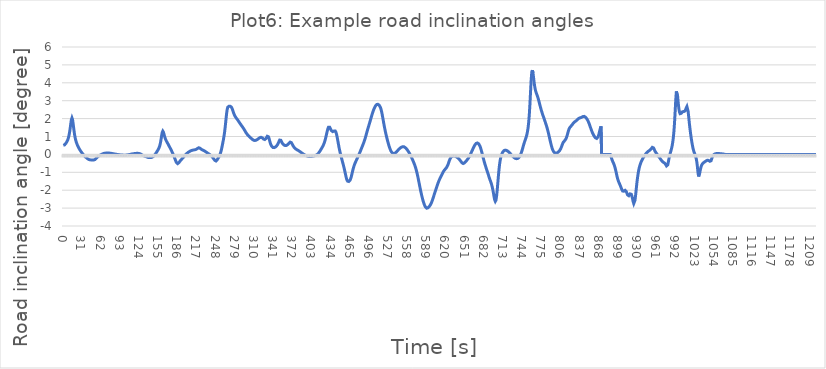
| Category | Series 0 |
|---|---|
| 0.0 | 0.505 |
| 1.0 | 0.505 |
| 2.0 | 0.532 |
| 3.0 | 0.567 |
| 4.0 | 0.61 |
| 5.0 | 0.661 |
| 6.0 | 0.722 |
| 7.0 | 0.797 |
| 8.0 | 0.895 |
| 9.0 | 1.027 |
| 10.0 | 1.203 |
| 11.0 | 1.429 |
| 12.0 | 1.692 |
| 13.0 | 1.93 |
| 14.0 | 2.037 |
| 15.0 | 1.941 |
| 16.0 | 1.693 |
| 17.0 | 1.408 |
| 18.0 | 1.158 |
| 19.0 | 0.96 |
| 20.0 | 0.806 |
| 21.0 | 0.685 |
| 22.0 | 0.585 |
| 23.0 | 0.501 |
| 24.0 | 0.427 |
| 25.0 | 0.361 |
| 26.0 | 0.301 |
| 27.0 | 0.245 |
| 28.0 | 0.191 |
| 29.0 | 0.14 |
| 30.0 | 0.092 |
| 31.0 | 0.048 |
| 32.0 | 0.006 |
| 33.0 | -0.034 |
| 34.0 | -0.072 |
| 35.0 | -0.109 |
| 36.0 | -0.143 |
| 37.0 | -0.176 |
| 38.0 | -0.206 |
| 39.0 | -0.233 |
| 40.0 | -0.257 |
| 41.0 | -0.278 |
| 42.0 | -0.294 |
| 43.0 | -0.304 |
| 44.0 | -0.308 |
| 45.0 | -0.308 |
| 46.0 | -0.307 |
| 47.0 | -0.308 |
| 48.0 | -0.311 |
| 49.0 | -0.313 |
| 50.0 | -0.308 |
| 51.0 | -0.291 |
| 52.0 | -0.262 |
| 53.0 | -0.226 |
| 54.0 | -0.189 |
| 55.0 | -0.154 |
| 56.0 | -0.124 |
| 57.0 | -0.098 |
| 58.0 | -0.074 |
| 59.0 | -0.053 |
| 60.0 | -0.032 |
| 61.0 | -0.013 |
| 62.0 | 0.006 |
| 63.0 | 0.023 |
| 64.0 | 0.037 |
| 65.0 | 0.05 |
| 66.0 | 0.059 |
| 67.0 | 0.066 |
| 68.0 | 0.071 |
| 69.0 | 0.074 |
| 70.0 | 0.075 |
| 71.0 | 0.076 |
| 72.0 | 0.076 |
| 73.0 | 0.075 |
| 74.0 | 0.074 |
| 75.0 | 0.071 |
| 76.0 | 0.067 |
| 77.0 | 0.062 |
| 78.0 | 0.056 |
| 79.0 | 0.049 |
| 80.0 | 0.042 |
| 81.0 | 0.036 |
| 82.0 | 0.029 |
| 83.0 | 0.023 |
| 84.0 | 0.017 |
| 85.0 | 0.011 |
| 86.0 | 0.005 |
| 87.0 | -0.001 |
| 88.0 | -0.006 |
| 89.0 | -0.012 |
| 90.0 | -0.017 |
| 91.0 | -0.022 |
| 92.0 | -0.027 |
| 93.0 | -0.031 |
| 94.0 | -0.034 |
| 95.0 | -0.037 |
| 96.0 | -0.039 |
| 97.0 | -0.041 |
| 98.0 | -0.042 |
| 99.0 | -0.042 |
| 100.0 | -0.042 |
| 101.0 | -0.041 |
| 102.0 | -0.038 |
| 103.0 | -0.034 |
| 104.0 | -0.028 |
| 105.0 | -0.021 |
| 106.0 | -0.014 |
| 107.0 | -0.006 |
| 108.0 | 0.001 |
| 109.0 | 0.009 |
| 110.0 | 0.016 |
| 111.0 | 0.022 |
| 112.0 | 0.029 |
| 113.0 | 0.034 |
| 114.0 | 0.04 |
| 115.0 | 0.045 |
| 116.0 | 0.05 |
| 117.0 | 0.054 |
| 118.0 | 0.058 |
| 119.0 | 0.06 |
| 120.0 | 0.06 |
| 121.0 | 0.058 |
| 122.0 | 0.054 |
| 123.0 | 0.047 |
| 124.0 | 0.037 |
| 125.0 | 0.022 |
| 126.0 | 0.002 |
| 127.0 | -0.021 |
| 128.0 | -0.043 |
| 129.0 | -0.062 |
| 130.0 | -0.076 |
| 131.0 | -0.089 |
| 132.0 | -0.102 |
| 133.0 | -0.115 |
| 134.0 | -0.129 |
| 135.0 | -0.142 |
| 136.0 | -0.155 |
| 137.0 | -0.166 |
| 138.0 | -0.174 |
| 139.0 | -0.179 |
| 140.0 | -0.181 |
| 141.0 | -0.179 |
| 142.0 | -0.174 |
| 143.0 | -0.165 |
| 144.0 | -0.151 |
| 145.0 | -0.13 |
| 146.0 | -0.102 |
| 147.0 | -0.066 |
| 148.0 | -0.023 |
| 149.0 | 0.025 |
| 150.0 | 0.076 |
| 151.0 | 0.129 |
| 152.0 | 0.183 |
| 153.0 | 0.239 |
| 154.0 | 0.301 |
| 155.0 | 0.376 |
| 156.0 | 0.475 |
| 157.0 | 0.614 |
| 158.0 | 0.802 |
| 159.0 | 1.026 |
| 160.0 | 1.222 |
| 161.0 | 1.299 |
| 162.0 | 1.241 |
| 163.0 | 1.116 |
| 164.0 | 0.989 |
| 165.0 | 0.884 |
| 166.0 | 0.801 |
| 167.0 | 0.733 |
| 168.0 | 0.67 |
| 169.0 | 0.608 |
| 170.0 | 0.545 |
| 171.0 | 0.48 |
| 172.0 | 0.414 |
| 173.0 | 0.347 |
| 174.0 | 0.28 |
| 175.0 | 0.21 |
| 176.0 | 0.138 |
| 177.0 | 0.064 |
| 178.0 | -0.014 |
| 179.0 | -0.097 |
| 180.0 | -0.186 |
| 181.0 | -0.28 |
| 182.0 | -0.372 |
| 183.0 | -0.451 |
| 184.0 | -0.501 |
| 185.0 | -0.515 |
| 186.0 | -0.497 |
| 187.0 | -0.459 |
| 188.0 | -0.415 |
| 189.0 | -0.37 |
| 190.0 | -0.328 |
| 191.0 | -0.289 |
| 192.0 | -0.251 |
| 193.0 | -0.212 |
| 194.0 | -0.173 |
| 195.0 | -0.132 |
| 196.0 | -0.091 |
| 197.0 | -0.051 |
| 198.0 | -0.013 |
| 199.0 | 0.023 |
| 200.0 | 0.056 |
| 201.0 | 0.086 |
| 202.0 | 0.113 |
| 203.0 | 0.137 |
| 204.0 | 0.159 |
| 205.0 | 0.178 |
| 206.0 | 0.196 |
| 207.0 | 0.211 |
| 208.0 | 0.224 |
| 209.0 | 0.235 |
| 210.0 | 0.243 |
| 211.0 | 0.248 |
| 212.0 | 0.253 |
| 213.0 | 0.259 |
| 214.0 | 0.268 |
| 215.0 | 0.282 |
| 216.0 | 0.302 |
| 217.0 | 0.327 |
| 218.0 | 0.353 |
| 219.0 | 0.369 |
| 220.0 | 0.368 |
| 221.0 | 0.35 |
| 222.0 | 0.322 |
| 223.0 | 0.294 |
| 224.0 | 0.271 |
| 225.0 | 0.251 |
| 226.0 | 0.235 |
| 227.0 | 0.218 |
| 228.0 | 0.201 |
| 229.0 | 0.18 |
| 230.0 | 0.158 |
| 231.0 | 0.134 |
| 232.0 | 0.109 |
| 233.0 | 0.084 |
| 234.0 | 0.059 |
| 235.0 | 0.036 |
| 236.0 | 0.013 |
| 237.0 | -0.01 |
| 238.0 | -0.036 |
| 239.0 | -0.065 |
| 240.0 | -0.1 |
| 241.0 | -0.139 |
| 242.0 | -0.183 |
| 243.0 | -0.231 |
| 244.0 | -0.282 |
| 245.0 | -0.328 |
| 246.0 | -0.361 |
| 247.0 | -0.367 |
| 248.0 | -0.343 |
| 249.0 | -0.297 |
| 250.0 | -0.241 |
| 251.0 | -0.183 |
| 252.0 | -0.121 |
| 253.0 | -0.05 |
| 254.0 | 0.038 |
| 255.0 | 0.152 |
| 256.0 | 0.294 |
| 257.0 | 0.458 |
| 258.0 | 0.632 |
| 259.0 | 0.813 |
| 260.0 | 1.015 |
| 261.0 | 1.256 |
| 262.0 | 1.551 |
| 263.0 | 1.887 |
| 264.0 | 2.22 |
| 265.0 | 2.479 |
| 266.0 | 2.628 |
| 267.0 | 2.683 |
| 268.0 | 2.691 |
| 269.0 | 2.69 |
| 270.0 | 2.69 |
| 271.0 | 2.679 |
| 272.0 | 2.643 |
| 273.0 | 2.574 |
| 274.0 | 2.478 |
| 275.0 | 2.373 |
| 276.0 | 2.274 |
| 277.0 | 2.191 |
| 278.0 | 2.124 |
| 279.0 | 2.07 |
| 280.0 | 2.023 |
| 281.0 | 1.978 |
| 282.0 | 1.931 |
| 283.0 | 1.882 |
| 284.0 | 1.831 |
| 285.0 | 1.779 |
| 286.0 | 1.726 |
| 287.0 | 1.675 |
| 288.0 | 1.626 |
| 289.0 | 1.578 |
| 290.0 | 1.53 |
| 291.0 | 1.481 |
| 292.0 | 1.428 |
| 293.0 | 1.371 |
| 294.0 | 1.311 |
| 295.0 | 1.251 |
| 296.0 | 1.195 |
| 297.0 | 1.144 |
| 298.0 | 1.101 |
| 299.0 | 1.064 |
| 300.0 | 1.031 |
| 301.0 | 0.999 |
| 302.0 | 0.966 |
| 303.0 | 0.932 |
| 304.0 | 0.898 |
| 305.0 | 0.865 |
| 306.0 | 0.835 |
| 307.0 | 0.809 |
| 308.0 | 0.79 |
| 309.0 | 0.779 |
| 310.0 | 0.776 |
| 311.0 | 0.782 |
| 312.0 | 0.794 |
| 313.0 | 0.812 |
| 314.0 | 0.834 |
| 315.0 | 0.859 |
| 316.0 | 0.886 |
| 317.0 | 0.912 |
| 318.0 | 0.936 |
| 319.0 | 0.952 |
| 320.0 | 0.956 |
| 321.0 | 0.946 |
| 322.0 | 0.922 |
| 323.0 | 0.89 |
| 324.0 | 0.858 |
| 325.0 | 0.836 |
| 326.0 | 0.831 |
| 327.0 | 0.85 |
| 328.0 | 0.893 |
| 329.0 | 0.954 |
| 330.0 | 1.012 |
| 331.0 | 1.031 |
| 332.0 | 0.983 |
| 333.0 | 0.875 |
| 334.0 | 0.745 |
| 335.0 | 0.625 |
| 336.0 | 0.53 |
| 337.0 | 0.462 |
| 338.0 | 0.416 |
| 339.0 | 0.39 |
| 340.0 | 0.378 |
| 341.0 | 0.379 |
| 342.0 | 0.39 |
| 343.0 | 0.408 |
| 344.0 | 0.434 |
| 345.0 | 0.467 |
| 346.0 | 0.51 |
| 347.0 | 0.568 |
| 348.0 | 0.643 |
| 349.0 | 0.728 |
| 350.0 | 0.8 |
| 351.0 | 0.824 |
| 352.0 | 0.789 |
| 353.0 | 0.72 |
| 354.0 | 0.649 |
| 355.0 | 0.592 |
| 356.0 | 0.551 |
| 357.0 | 0.524 |
| 358.0 | 0.506 |
| 359.0 | 0.497 |
| 360.0 | 0.496 |
| 361.0 | 0.503 |
| 362.0 | 0.521 |
| 363.0 | 0.547 |
| 364.0 | 0.582 |
| 365.0 | 0.622 |
| 366.0 | 0.66 |
| 367.0 | 0.685 |
| 368.0 | 0.686 |
| 369.0 | 0.658 |
| 370.0 | 0.603 |
| 371.0 | 0.537 |
| 372.0 | 0.472 |
| 373.0 | 0.416 |
| 374.0 | 0.37 |
| 375.0 | 0.334 |
| 376.0 | 0.306 |
| 377.0 | 0.282 |
| 378.0 | 0.261 |
| 379.0 | 0.241 |
| 380.0 | 0.222 |
| 381.0 | 0.201 |
| 382.0 | 0.18 |
| 383.0 | 0.156 |
| 384.0 | 0.13 |
| 385.0 | 0.103 |
| 386.0 | 0.076 |
| 387.0 | 0.05 |
| 388.0 | 0.026 |
| 389.0 | 0.005 |
| 390.0 | -0.015 |
| 391.0 | -0.034 |
| 392.0 | -0.053 |
| 393.0 | -0.07 |
| 394.0 | -0.087 |
| 395.0 | -0.101 |
| 396.0 | -0.111 |
| 397.0 | -0.117 |
| 398.0 | -0.12 |
| 399.0 | -0.119 |
| 400.0 | -0.117 |
| 401.0 | -0.114 |
| 402.0 | -0.11 |
| 403.0 | -0.105 |
| 404.0 | -0.099 |
| 405.0 | -0.091 |
| 406.0 | -0.082 |
| 407.0 | -0.071 |
| 408.0 | -0.057 |
| 409.0 | -0.041 |
| 410.0 | -0.02 |
| 411.0 | 0.005 |
| 412.0 | 0.036 |
| 413.0 | 0.074 |
| 414.0 | 0.118 |
| 415.0 | 0.169 |
| 416.0 | 0.224 |
| 417.0 | 0.282 |
| 418.0 | 0.341 |
| 419.0 | 0.401 |
| 420.0 | 0.465 |
| 421.0 | 0.538 |
| 422.0 | 0.624 |
| 423.0 | 0.728 |
| 424.0 | 0.851 |
| 425.0 | 0.991 |
| 426.0 | 1.142 |
| 427.0 | 1.292 |
| 428.0 | 1.424 |
| 429.0 | 1.514 |
| 430.0 | 1.546 |
| 431.0 | 1.519 |
| 432.0 | 1.455 |
| 433.0 | 1.381 |
| 434.0 | 1.321 |
| 435.0 | 1.285 |
| 436.0 | 1.274 |
| 437.0 | 1.285 |
| 438.0 | 1.305 |
| 439.0 | 1.319 |
| 440.0 | 1.307 |
| 441.0 | 1.25 |
| 442.0 | 1.139 |
| 443.0 | 0.981 |
| 444.0 | 0.795 |
| 445.0 | 0.601 |
| 446.0 | 0.416 |
| 447.0 | 0.246 |
| 448.0 | 0.092 |
| 449.0 | -0.051 |
| 450.0 | -0.187 |
| 451.0 | -0.318 |
| 452.0 | -0.447 |
| 453.0 | -0.578 |
| 454.0 | -0.715 |
| 455.0 | -0.862 |
| 456.0 | -1.019 |
| 457.0 | -1.179 |
| 458.0 | -1.323 |
| 459.0 | -1.433 |
| 460.0 | -1.497 |
| 461.0 | -1.52 |
| 462.0 | -1.514 |
| 463.0 | -1.487 |
| 464.0 | -1.437 |
| 465.0 | -1.356 |
| 466.0 | -1.239 |
| 467.0 | -1.096 |
| 468.0 | -0.946 |
| 469.0 | -0.806 |
| 470.0 | -0.685 |
| 471.0 | -0.582 |
| 472.0 | -0.494 |
| 473.0 | -0.415 |
| 474.0 | -0.339 |
| 475.0 | -0.265 |
| 476.0 | -0.19 |
| 477.0 | -0.114 |
| 478.0 | -0.036 |
| 479.0 | 0.044 |
| 480.0 | 0.126 |
| 481.0 | 0.21 |
| 482.0 | 0.296 |
| 483.0 | 0.383 |
| 484.0 | 0.47 |
| 485.0 | 0.557 |
| 486.0 | 0.648 |
| 487.0 | 0.745 |
| 488.0 | 0.851 |
| 489.0 | 0.966 |
| 490.0 | 1.089 |
| 491.0 | 1.215 |
| 492.0 | 1.34 |
| 493.0 | 1.459 |
| 494.0 | 1.573 |
| 495.0 | 1.686 |
| 496.0 | 1.801 |
| 497.0 | 1.921 |
| 498.0 | 2.042 |
| 499.0 | 2.162 |
| 500.0 | 2.276 |
| 501.0 | 2.381 |
| 502.0 | 2.477 |
| 503.0 | 2.563 |
| 504.0 | 2.64 |
| 505.0 | 2.704 |
| 506.0 | 2.754 |
| 507.0 | 2.787 |
| 508.0 | 2.801 |
| 509.0 | 2.8 |
| 510.0 | 2.784 |
| 511.0 | 2.753 |
| 512.0 | 2.705 |
| 513.0 | 2.633 |
| 514.0 | 2.529 |
| 515.0 | 2.391 |
| 516.0 | 2.221 |
| 517.0 | 2.032 |
| 518.0 | 1.835 |
| 519.0 | 1.643 |
| 520.0 | 1.462 |
| 521.0 | 1.294 |
| 522.0 | 1.138 |
| 523.0 | 0.991 |
| 524.0 | 0.852 |
| 525.0 | 0.72 |
| 526.0 | 0.594 |
| 527.0 | 0.477 |
| 528.0 | 0.371 |
| 529.0 | 0.278 |
| 530.0 | 0.2 |
| 531.0 | 0.139 |
| 532.0 | 0.093 |
| 533.0 | 0.063 |
| 534.0 | 0.048 |
| 535.0 | 0.046 |
| 536.0 | 0.055 |
| 537.0 | 0.074 |
| 538.0 | 0.101 |
| 539.0 | 0.135 |
| 540.0 | 0.174 |
| 541.0 | 0.214 |
| 542.0 | 0.254 |
| 543.0 | 0.291 |
| 544.0 | 0.325 |
| 545.0 | 0.354 |
| 546.0 | 0.38 |
| 547.0 | 0.401 |
| 548.0 | 0.418 |
| 549.0 | 0.429 |
| 550.0 | 0.432 |
| 551.0 | 0.427 |
| 552.0 | 0.412 |
| 553.0 | 0.388 |
| 554.0 | 0.357 |
| 555.0 | 0.32 |
| 556.0 | 0.279 |
| 557.0 | 0.232 |
| 558.0 | 0.181 |
| 559.0 | 0.124 |
| 560.0 | 0.064 |
| 561.0 | -0.001 |
| 562.0 | -0.069 |
| 563.0 | -0.14 |
| 564.0 | -0.213 |
| 565.0 | -0.289 |
| 566.0 | -0.368 |
| 567.0 | -0.452 |
| 568.0 | -0.54 |
| 569.0 | -0.636 |
| 570.0 | -0.742 |
| 571.0 | -0.861 |
| 572.0 | -0.996 |
| 573.0 | -1.145 |
| 574.0 | -1.306 |
| 575.0 | -1.477 |
| 576.0 | -1.651 |
| 577.0 | -1.825 |
| 578.0 | -1.994 |
| 579.0 | -2.155 |
| 580.0 | -2.307 |
| 581.0 | -2.447 |
| 582.0 | -2.575 |
| 583.0 | -2.691 |
| 584.0 | -2.792 |
| 585.0 | -2.875 |
| 586.0 | -2.939 |
| 587.0 | -2.982 |
| 588.0 | -3.002 |
| 589.0 | -3.002 |
| 590.0 | -2.985 |
| 591.0 | -2.956 |
| 592.0 | -2.918 |
| 593.0 | -2.872 |
| 594.0 | -2.817 |
| 595.0 | -2.75 |
| 596.0 | -2.67 |
| 597.0 | -2.577 |
| 598.0 | -2.475 |
| 599.0 | -2.368 |
| 600.0 | -2.26 |
| 601.0 | -2.152 |
| 602.0 | -2.045 |
| 603.0 | -1.939 |
| 604.0 | -1.834 |
| 605.0 | -1.732 |
| 606.0 | -1.633 |
| 607.0 | -1.541 |
| 608.0 | -1.456 |
| 609.0 | -1.379 |
| 610.0 | -1.306 |
| 611.0 | -1.236 |
| 612.0 | -1.167 |
| 613.0 | -1.097 |
| 614.0 | -1.029 |
| 615.0 | -0.965 |
| 616.0 | -0.909 |
| 617.0 | -0.861 |
| 618.0 | -0.819 |
| 619.0 | -0.781 |
| 620.0 | -0.739 |
| 621.0 | -0.683 |
| 622.0 | -0.609 |
| 623.0 | -0.515 |
| 624.0 | -0.411 |
| 625.0 | -0.314 |
| 626.0 | -0.234 |
| 627.0 | -0.176 |
| 628.0 | -0.135 |
| 629.0 | -0.11 |
| 630.0 | -0.095 |
| 631.0 | -0.088 |
| 632.0 | -0.087 |
| 633.0 | -0.093 |
| 634.0 | -0.103 |
| 635.0 | -0.117 |
| 636.0 | -0.135 |
| 637.0 | -0.157 |
| 638.0 | -0.183 |
| 639.0 | -0.213 |
| 640.0 | -0.247 |
| 641.0 | -0.286 |
| 642.0 | -0.329 |
| 643.0 | -0.376 |
| 644.0 | -0.423 |
| 645.0 | -0.466 |
| 646.0 | -0.497 |
| 647.0 | -0.51 |
| 648.0 | -0.502 |
| 649.0 | -0.477 |
| 650.0 | -0.443 |
| 651.0 | -0.405 |
| 652.0 | -0.366 |
| 653.0 | -0.325 |
| 654.0 | -0.28 |
| 655.0 | -0.23 |
| 656.0 | -0.174 |
| 657.0 | -0.113 |
| 658.0 | -0.046 |
| 659.0 | 0.025 |
| 660.0 | 0.099 |
| 661.0 | 0.174 |
| 662.0 | 0.25 |
| 663.0 | 0.325 |
| 664.0 | 0.399 |
| 665.0 | 0.468 |
| 666.0 | 0.53 |
| 667.0 | 0.58 |
| 668.0 | 0.616 |
| 669.0 | 0.635 |
| 670.0 | 0.638 |
| 671.0 | 0.625 |
| 672.0 | 0.594 |
| 673.0 | 0.545 |
| 674.0 | 0.474 |
| 675.0 | 0.381 |
| 676.0 | 0.269 |
| 677.0 | 0.142 |
| 678.0 | 0.006 |
| 679.0 | -0.132 |
| 680.0 | -0.268 |
| 681.0 | -0.399 |
| 682.0 | -0.52 |
| 683.0 | -0.633 |
| 684.0 | -0.739 |
| 685.0 | -0.843 |
| 686.0 | -0.948 |
| 687.0 | -1.056 |
| 688.0 | -1.167 |
| 689.0 | -1.275 |
| 690.0 | -1.379 |
| 691.0 | -1.477 |
| 692.0 | -1.576 |
| 693.0 | -1.685 |
| 694.0 | -1.816 |
| 695.0 | -1.976 |
| 696.0 | -2.165 |
| 697.0 | -2.367 |
| 698.0 | -2.54 |
| 699.0 | -2.622 |
| 700.0 | -2.561 |
| 701.0 | -2.348 |
| 702.0 | -2.017 |
| 703.0 | -1.618 |
| 704.0 | -1.206 |
| 705.0 | -0.832 |
| 706.0 | -0.531 |
| 707.0 | -0.307 |
| 708.0 | -0.145 |
| 709.0 | -0.027 |
| 710.0 | 0.06 |
| 711.0 | 0.127 |
| 712.0 | 0.176 |
| 713.0 | 0.21 |
| 714.0 | 0.23 |
| 715.0 | 0.237 |
| 716.0 | 0.235 |
| 717.0 | 0.225 |
| 718.0 | 0.208 |
| 719.0 | 0.185 |
| 720.0 | 0.157 |
| 721.0 | 0.125 |
| 722.0 | 0.09 |
| 723.0 | 0.052 |
| 724.0 | 0.014 |
| 725.0 | -0.024 |
| 726.0 | -0.062 |
| 727.0 | -0.099 |
| 728.0 | -0.133 |
| 729.0 | -0.165 |
| 730.0 | -0.192 |
| 731.0 | -0.214 |
| 732.0 | -0.231 |
| 733.0 | -0.239 |
| 734.0 | -0.239 |
| 735.0 | -0.229 |
| 736.0 | -0.209 |
| 737.0 | -0.177 |
| 738.0 | -0.133 |
| 739.0 | -0.075 |
| 740.0 | -0.002 |
| 741.0 | 0.088 |
| 742.0 | 0.192 |
| 743.0 | 0.309 |
| 744.0 | 0.432 |
| 745.0 | 0.555 |
| 746.0 | 0.668 |
| 747.0 | 0.772 |
| 748.0 | 0.871 |
| 749.0 | 0.974 |
| 750.0 | 1.098 |
| 751.0 | 1.259 |
| 752.0 | 1.48 |
| 753.0 | 1.79 |
| 754.0 | 2.221 |
| 755.0 | 2.795 |
| 756.0 | 3.482 |
| 757.0 | 4.152 |
| 758.0 | 4.6 |
| 759.0 | 4.707 |
| 760.0 | 4.542 |
| 761.0 | 4.257 |
| 762.0 | 3.973 |
| 763.0 | 3.743 |
| 764.0 | 3.577 |
| 765.0 | 3.459 |
| 766.0 | 3.365 |
| 767.0 | 3.272 |
| 768.0 | 3.166 |
| 769.0 | 3.044 |
| 770.0 | 2.912 |
| 771.0 | 2.777 |
| 772.0 | 2.644 |
| 773.0 | 2.518 |
| 774.0 | 2.401 |
| 775.0 | 2.291 |
| 776.0 | 2.188 |
| 777.0 | 2.088 |
| 778.0 | 1.99 |
| 779.0 | 1.891 |
| 780.0 | 1.79 |
| 781.0 | 1.684 |
| 782.0 | 1.572 |
| 783.0 | 1.452 |
| 784.0 | 1.322 |
| 785.0 | 1.183 |
| 786.0 | 1.035 |
| 787.0 | 0.883 |
| 788.0 | 0.732 |
| 789.0 | 0.586 |
| 790.0 | 0.452 |
| 791.0 | 0.337 |
| 792.0 | 0.243 |
| 793.0 | 0.172 |
| 794.0 | 0.122 |
| 795.0 | 0.089 |
| 796.0 | 0.07 |
| 797.0 | 0.064 |
| 798.0 | 0.069 |
| 799.0 | 0.084 |
| 800.0 | 0.106 |
| 801.0 | 0.135 |
| 802.0 | 0.17 |
| 803.0 | 0.211 |
| 804.0 | 0.264 |
| 805.0 | 0.333 |
| 806.0 | 0.417 |
| 807.0 | 0.513 |
| 808.0 | 0.604 |
| 809.0 | 0.676 |
| 810.0 | 0.724 |
| 811.0 | 0.759 |
| 812.0 | 0.797 |
| 813.0 | 0.851 |
| 814.0 | 0.929 |
| 815.0 | 1.032 |
| 816.0 | 1.155 |
| 817.0 | 1.282 |
| 818.0 | 1.392 |
| 819.0 | 1.472 |
| 820.0 | 1.524 |
| 821.0 | 1.561 |
| 822.0 | 1.597 |
| 823.0 | 1.639 |
| 824.0 | 1.687 |
| 825.0 | 1.735 |
| 826.0 | 1.776 |
| 827.0 | 1.808 |
| 828.0 | 1.833 |
| 829.0 | 1.857 |
| 830.0 | 1.884 |
| 831.0 | 1.917 |
| 832.0 | 1.953 |
| 833.0 | 1.986 |
| 834.0 | 2.013 |
| 835.0 | 2.03 |
| 836.0 | 2.04 |
| 837.0 | 2.05 |
| 838.0 | 2.062 |
| 839.0 | 2.08 |
| 840.0 | 2.1 |
| 841.0 | 2.118 |
| 842.0 | 2.127 |
| 843.0 | 2.124 |
| 844.0 | 2.107 |
| 845.0 | 2.078 |
| 846.0 | 2.038 |
| 847.0 | 1.99 |
| 848.0 | 1.933 |
| 849.0 | 1.868 |
| 850.0 | 1.791 |
| 851.0 | 1.703 |
| 852.0 | 1.606 |
| 853.0 | 1.504 |
| 854.0 | 1.404 |
| 855.0 | 1.31 |
| 856.0 | 1.225 |
| 857.0 | 1.15 |
| 858.0 | 1.082 |
| 859.0 | 1.022 |
| 860.0 | 0.969 |
| 861.0 | 0.927 |
| 862.0 | 0.898 |
| 863.0 | 0.891 |
| 864.0 | 0.91 |
| 865.0 | 0.962 |
| 866.0 | 1.053 |
| 867.0 | 1.181 |
| 868.0 | 1.33 |
| 869.0 | 1.469 |
| 870.0 | 1.566 |
| 871.0 | 0 |
| 872.0 | 0 |
| 873.0 | 0 |
| 874.0 | 0 |
| 875.0 | 0 |
| 876.0 | 0 |
| 877.0 | 0 |
| 878.0 | 0 |
| 879.0 | 0 |
| 880.0 | 0 |
| 881.0 | 0 |
| 882.0 | 0 |
| 883.0 | 0 |
| 884.0 | 0 |
| 885.0 | 0 |
| 886.0 | 0.003 |
| 887.0 | -0.207 |
| 888.0 | -0.317 |
| 889.0 | -0.397 |
| 890.0 | -0.472 |
| 891.0 | -0.556 |
| 892.0 | -0.655 |
| 893.0 | -0.775 |
| 894.0 | -0.918 |
| 895.0 | -1.076 |
| 896.0 | -1.233 |
| 897.0 | -1.369 |
| 898.0 | -1.478 |
| 899.0 | -1.564 |
| 900.0 | -1.642 |
| 901.0 | -1.723 |
| 902.0 | -1.811 |
| 903.0 | -1.901 |
| 904.0 | -1.985 |
| 905.0 | -2.044 |
| 906.0 | -2.068 |
| 907.0 | -2.055 |
| 908.0 | -2.025 |
| 909.0 | -2.007 |
| 910.0 | -2.022 |
| 911.0 | -2.081 |
| 912.0 | -2.172 |
| 913.0 | -2.263 |
| 914.0 | -2.315 |
| 915.0 | -2.308 |
| 916.0 | -2.259 |
| 917.0 | -2.207 |
| 918.0 | -2.19 |
| 919.0 | -2.227 |
| 920.0 | -2.325 |
| 921.0 | -2.471 |
| 922.0 | -2.632 |
| 923.0 | -2.745 |
| 924.0 | -2.736 |
| 925.0 | -2.571 |
| 926.0 | -2.283 |
| 927.0 | -1.944 |
| 928.0 | -1.615 |
| 929.0 | -1.327 |
| 930.0 | -1.087 |
| 931.0 | -0.892 |
| 932.0 | -0.734 |
| 933.0 | -0.608 |
| 934.0 | -0.504 |
| 935.0 | -0.417 |
| 936.0 | -0.34 |
| 937.0 | -0.272 |
| 938.0 | -0.208 |
| 939.0 | -0.149 |
| 940.0 | -0.093 |
| 941.0 | -0.041 |
| 942.0 | 0.008 |
| 943.0 | 0.053 |
| 944.0 | 0.095 |
| 945.0 | 0.131 |
| 946.0 | 0.161 |
| 947.0 | 0.186 |
| 948.0 | 0.209 |
| 949.0 | 0.234 |
| 950.0 | 0.264 |
| 951.0 | 0.304 |
| 952.0 | 0.351 |
| 953.0 | 0.393 |
| 954.0 | 0.401 |
| 955.0 | 0.361 |
| 956.0 | 0.288 |
| 957.0 | 0.213 |
| 958.0 | 0.147 |
| 959.0 | 0.091 |
| 960.0 | 0.041 |
| 961.0 | -0.007 |
| 962.0 | -0.054 |
| 963.0 | -0.101 |
| 964.0 | -0.148 |
| 965.0 | -0.196 |
| 966.0 | -0.245 |
| 967.0 | -0.296 |
| 968.0 | -0.345 |
| 969.0 | -0.388 |
| 970.0 | -0.42 |
| 971.0 | -0.443 |
| 972.0 | -0.462 |
| 973.0 | -0.487 |
| 974.0 | -0.526 |
| 975.0 | -0.583 |
| 976.0 | -0.644 |
| 977.0 | -0.664 |
| 978.0 | -0.586 |
| 979.0 | -0.416 |
| 980.0 | -0.228 |
| 981.0 | -0.07 |
| 982.0 | 0.061 |
| 983.0 | 0.181 |
| 984.0 | 0.309 |
| 985.0 | 0.462 |
| 986.0 | 0.659 |
| 987.0 | 0.923 |
| 988.0 | 1.284 |
| 989.0 | 1.775 |
| 990.0 | 2.402 |
| 991.0 | 3.068 |
| 992.0 | 3.52 |
| 993.0 | 3.545 |
| 994.0 | 3.243 |
| 995.0 | 2.864 |
| 996.0 | 2.558 |
| 997.0 | 2.366 |
| 998.0 | 2.276 |
| 999.0 | 2.263 |
| 1000.0 | 2.299 |
| 1001.0 | 2.35 |
| 1002.0 | 2.387 |
| 1003.0 | 2.399 |
| 1004.0 | 2.395 |
| 1005.0 | 2.396 |
| 1006.0 | 2.429 |
| 1007.0 | 2.504 |
| 1008.0 | 2.605 |
| 1009.0 | 2.673 |
| 1010.0 | 2.619 |
| 1011.0 | 2.4 |
| 1012.0 | 2.071 |
| 1013.0 | 1.728 |
| 1014.0 | 1.423 |
| 1015.0 | 1.157 |
| 1016.0 | 0.914 |
| 1017.0 | 0.687 |
| 1018.0 | 0.487 |
| 1019.0 | 0.323 |
| 1020.0 | 0.195 |
| 1021.0 | 0.093 |
| 1022.0 | 0.002 |
| 1023.0 | -0.095 |
| 1024.0 | -0.222 |
| 1025.0 | -0.409 |
| 1026.0 | -0.69 |
| 1027.0 | -1.027 |
| 1028.0 | -1.233 |
| 1029.0 | -1.177 |
| 1030.0 | -0.991 |
| 1031.0 | -0.813 |
| 1032.0 | -0.681 |
| 1033.0 | -0.591 |
| 1034.0 | -0.531 |
| 1035.0 | -0.49 |
| 1036.0 | -0.461 |
| 1037.0 | -0.437 |
| 1038.0 | -0.413 |
| 1039.0 | -0.387 |
| 1040.0 | -0.362 |
| 1041.0 | -0.34 |
| 1042.0 | -0.327 |
| 1043.0 | -0.324 |
| 1044.0 | -0.334 |
| 1045.0 | -0.356 |
| 1046.0 | -0.383 |
| 1047.0 | -0.395 |
| 1048.0 | -0.357 |
| 1049.0 | -0.264 |
| 1050.0 | -0.159 |
| 1051.0 | -0.079 |
| 1052.0 | -0.027 |
| 1053.0 | 0.004 |
| 1054.0 | 0.024 |
| 1055.0 | 0.036 |
| 1056.0 | 0.044 |
| 1057.0 | 0.048 |
| 1058.0 | 0.05 |
| 1059.0 | 0.049 |
| 1060.0 | 0.047 |
| 1061.0 | 0.046 |
| 1062.0 | 0.043 |
| 1063.0 | 0.04 |
| 1064.0 | 0.037 |
| 1065.0 | 0.033 |
| 1066.0 | 0.029 |
| 1067.0 | 0.025 |
| 1068.0 | 0.02 |
| 1069.0 | 0.015 |
| 1070.0 | 0.01 |
| 1071.0 | 0 |
| 1072.0 | 0 |
| 1073.0 | 0 |
| 1074.0 | 0 |
| 1075.0 | 0 |
| 1076.0 | 0 |
| 1077.0 | 0 |
| 1078.0 | 0 |
| 1079.0 | 0 |
| 1080.0 | 0 |
| 1081.0 | 0 |
| 1082.0 | 0 |
| 1083.0 | 0 |
| 1084.0 | 0 |
| 1085.0 | 0 |
| 1086.0 | 0 |
| 1087.0 | 0 |
| 1088.0 | 0 |
| 1089.0 | 0 |
| 1090.0 | 0 |
| 1091.0 | 0 |
| 1092.0 | 0 |
| 1093.0 | 0 |
| 1094.0 | 0 |
| 1095.0 | 0 |
| 1096.0 | 0 |
| 1097.0 | 0 |
| 1098.0 | 0 |
| 1099.0 | 0 |
| 1100.0 | 0 |
| 1101.0 | 0 |
| 1102.0 | 0 |
| 1103.0 | 0 |
| 1104.0 | 0 |
| 1105.0 | 0 |
| 1106.0 | 0 |
| 1107.0 | 0 |
| 1108.0 | 0 |
| 1109.0 | 0 |
| 1110.0 | 0 |
| 1111.0 | 0 |
| 1112.0 | 0 |
| 1113.0 | 0 |
| 1114.0 | 0 |
| 1115.0 | 0 |
| 1116.0 | 0 |
| 1117.0 | 0 |
| 1118.0 | 0 |
| 1119.0 | 0 |
| 1120.0 | 0 |
| 1121.0 | 0 |
| 1122.0 | 0 |
| 1123.0 | 0 |
| 1124.0 | 0 |
| 1125.0 | 0 |
| 1126.0 | 0 |
| 1127.0 | 0 |
| 1128.0 | 0 |
| 1129.0 | 0 |
| 1130.0 | 0 |
| 1131.0 | 0 |
| 1132.0 | 0 |
| 1133.0 | 0 |
| 1134.0 | 0 |
| 1135.0 | 0 |
| 1136.0 | 0 |
| 1137.0 | 0 |
| 1138.0 | 0 |
| 1139.0 | 0 |
| 1140.0 | 0 |
| 1141.0 | 0 |
| 1142.0 | 0 |
| 1143.0 | 0 |
| 1144.0 | 0 |
| 1145.0 | 0 |
| 1146.0 | 0 |
| 1147.0 | 0 |
| 1148.0 | 0 |
| 1149.0 | 0 |
| 1150.0 | 0 |
| 1151.0 | 0 |
| 1152.0 | 0 |
| 1153.0 | 0 |
| 1154.0 | 0 |
| 1155.0 | 0 |
| 1156.0 | 0 |
| 1157.0 | 0 |
| 1158.0 | 0 |
| 1159.0 | 0 |
| 1160.0 | 0 |
| 1161.0 | 0 |
| 1162.0 | 0 |
| 1163.0 | 0 |
| 1164.0 | 0 |
| 1165.0 | 0 |
| 1166.0 | 0 |
| 1167.0 | 0 |
| 1168.0 | 0 |
| 1169.0 | 0 |
| 1170.0 | 0 |
| 1171.0 | 0 |
| 1172.0 | 0 |
| 1173.0 | 0 |
| 1174.0 | 0 |
| 1175.0 | 0 |
| 1176.0 | 0 |
| 1177.0 | 0 |
| 1178.0 | 0 |
| 1179.0 | 0 |
| 1180.0 | 0 |
| 1181.0 | 0 |
| 1182.0 | 0 |
| 1183.0 | 0 |
| 1184.0 | 0 |
| 1185.0 | 0 |
| 1186.0 | 0 |
| 1187.0 | 0 |
| 1188.0 | 0 |
| 1189.0 | 0 |
| 1190.0 | 0 |
| 1191.0 | 0 |
| 1192.0 | 0 |
| 1193.0 | 0 |
| 1194.0 | 0 |
| 1195.0 | 0 |
| 1196.0 | 0 |
| 1197.0 | 0 |
| 1198.0 | 0 |
| 1199.0 | 0 |
| 1200.0 | 0 |
| 1201.0 | 0 |
| 1202.0 | 0 |
| 1203.0 | 0 |
| 1204.0 | 0 |
| 1205.0 | 0 |
| 1206.0 | 0 |
| 1207.0 | 0 |
| 1208.0 | 0 |
| 1209.0 | 0 |
| 1210.0 | 0 |
| 1211.0 | 0 |
| 1212.0 | 0 |
| 1213.0 | 0 |
| 1214.0 | 0 |
| 1215.0 | 0 |
| 1216.0 | 0 |
| 1217.0 | 0 |
| 1218.0 | 0 |
| 1219.0 | 0 |